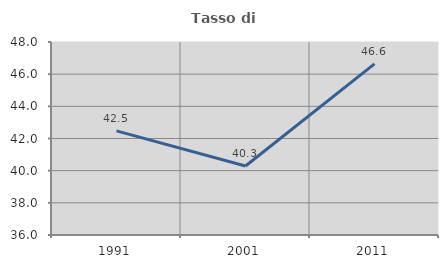
| Category | Tasso di occupazione   |
|---|---|
| 1991.0 | 42.472 |
| 2001.0 | 40.292 |
| 2011.0 | 46.636 |